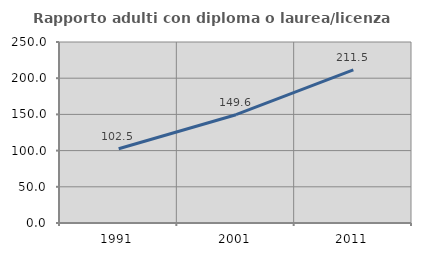
| Category | Rapporto adulti con diploma o laurea/licenza media  |
|---|---|
| 1991.0 | 102.539 |
| 2001.0 | 149.572 |
| 2011.0 | 211.527 |